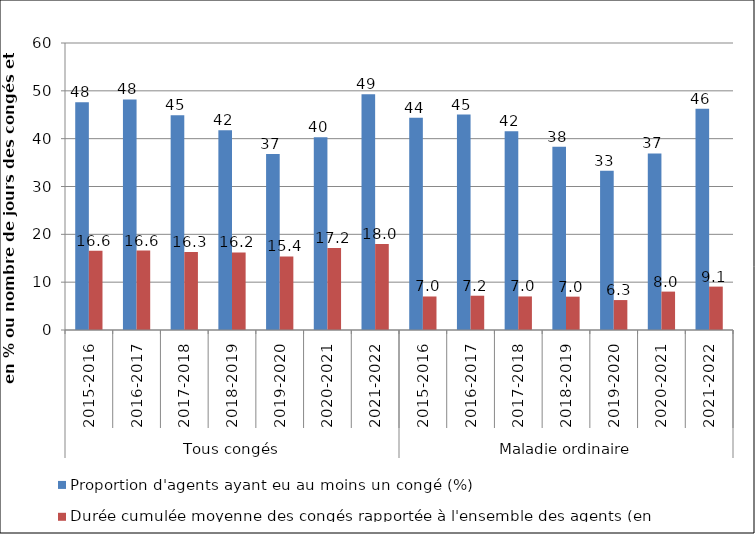
| Category | Proportion d'agents ayant eu au moins un congé (%) | Durée cumulée moyenne des congés rapportée à l'ensemble des agents (en jours) |
|---|---|---|
| 0 | 47.626 | 16.563 |
| 1 | 48.198 | 16.601 |
| 2 | 44.876 | 16.287 |
| 3 | 41.755 | 16.217 |
| 4 | 36.812 | 15.387 |
| 5 | 40.294 | 17.165 |
| 6 | 49.293 | 17.971 |
| 7 | 44.383 | 7.007 |
| 8 | 45.032 | 7.167 |
| 9 | 41.554 | 7.015 |
| 10 | 38.327 | 6.973 |
| 11 | 33.314 | 6.257 |
| 12 | 36.922 | 8.026 |
| 13 | 46.231 | 9.072 |